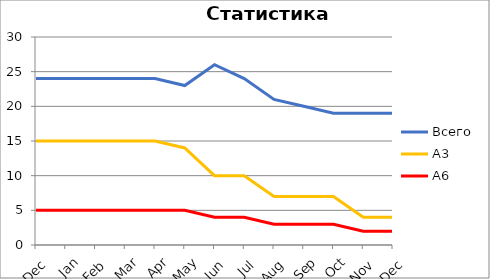
| Category | Всего | А3 | A6 |
|---|---|---|---|
| 0 | 24 | 15 | 5 |
| 1 | 24 | 15 | 5 |
| 2 | 24 | 15 | 5 |
| 3 | 24 | 15 | 5 |
| 4 | 24 | 15 | 5 |
| 5 | 23 | 14 | 5 |
| 6 | 26 | 10 | 4 |
| 7 | 24 | 10 | 4 |
| 8 | 21 | 7 | 3 |
| 9 | 20 | 7 | 3 |
| 10 | 19 | 7 | 3 |
| 11 | 19 | 4 | 2 |
| 12 | 19 | 4 | 2 |